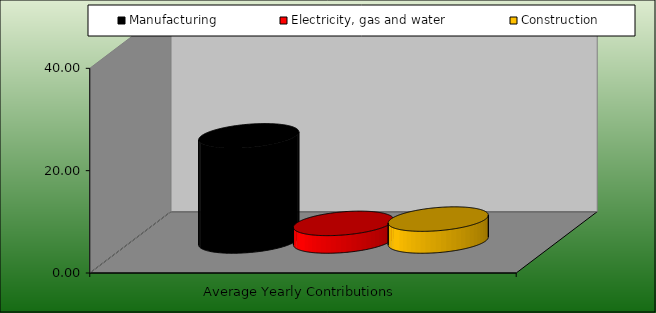
| Category | Manufacturing | Electricity, gas and water | Construction |
|---|---|---|---|
| Average Yearly Contributions | 20.55 | 3.444 | 4.282 |